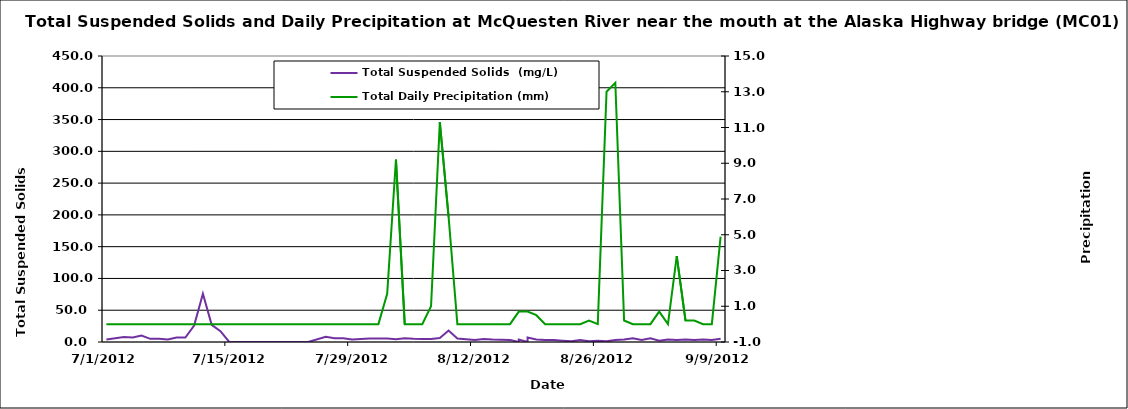
| Category | Total Suspended Solids  (mg/L) |
|---|---|
| 7/1/12 | 4 |
| 7/2/12 | 6 |
| 7/3/12 | 8 |
| 7/4/12 | 7 |
| 7/5/12 | 10 |
| 7/6/12 | 5 |
| 7/7/12 | 5 |
| 7/8/12 | 4 |
| 7/9/12 | 7 |
| 7/10/12 | 7 |
| 7/11/12 | 26 |
| 7/12/12 | 76 |
| 7/13/12 | 27 |
| 7/14/12 | 17 |
| 7/15/12 | 0 |
| 7/16/12 | 0 |
| 7/17/12 | 0 |
| 7/18/12 | 0 |
| 7/19/12 | 0 |
| 7/20/12 | 0 |
| 7/21/12 | 0 |
| 7/22/12 | 0 |
| 7/23/12 | 0 |
| 7/24/12 | 0 |
| 7/26/12 | 8.333 |
| 7/27/12 | 6 |
| 7/28/12 | 6 |
| 7/29/12 | 4 |
| 7/30/12 | 4.667 |
| 7/31/12 | 5.6 |
| 8/1/12 | 5.6 |
| 8/2/12 | 5.333 |
| 8/3/12 | 4.333 |
| 8/4/12 | 6 |
| 8/5/12 | 5.2 |
| 8/6/12 | 4.8 |
| 8/7/12 | 4.8 |
| 8/8/12 | 6.4 |
| 8/9/12 | 18 |
| 8/10/12 | 5.6 |
| 8/11/12 | 4.333 |
| 8/12/12 | 3.2 |
| 8/13/12 | 4.8 |
| 8/14/12 | 4 |
| 8/15/12 | 3.667 |
| 8/16/12 | 3.333 |
| 8/17/12 | 0 |
| 8/17/12 | 4 |
| 8/18/12 | 0 |
| 8/18/12 | 7 |
| 8/19/12 | 4 |
| 8/20/12 | 3 |
| 8/21/12 | 3 |
| 8/22/12 | 2 |
| 8/23/12 | 1 |
| 8/24/12 | 3 |
| 8/25/12 | 1 |
| 8/26/12 | 2 |
| 8/27/12 | 1 |
| 8/28/12 | 3 |
| 8/29/12 | 4 |
| 8/30/12 | 6 |
| 8/31/12 | 3 |
| 9/1/12 | 6 |
| 9/2/12 | 2 |
| 9/3/12 | 4 |
| 9/4/12 | 3 |
| 9/5/12 | 4 |
| 9/6/12 | 3 |
| 9/7/12 | 4 |
| 9/8/12 | 3 |
| 9/9/12 | 5 |